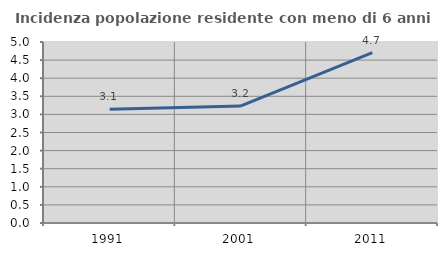
| Category | Incidenza popolazione residente con meno di 6 anni |
|---|---|
| 1991.0 | 3.14 |
| 2001.0 | 3.233 |
| 2011.0 | 4.708 |